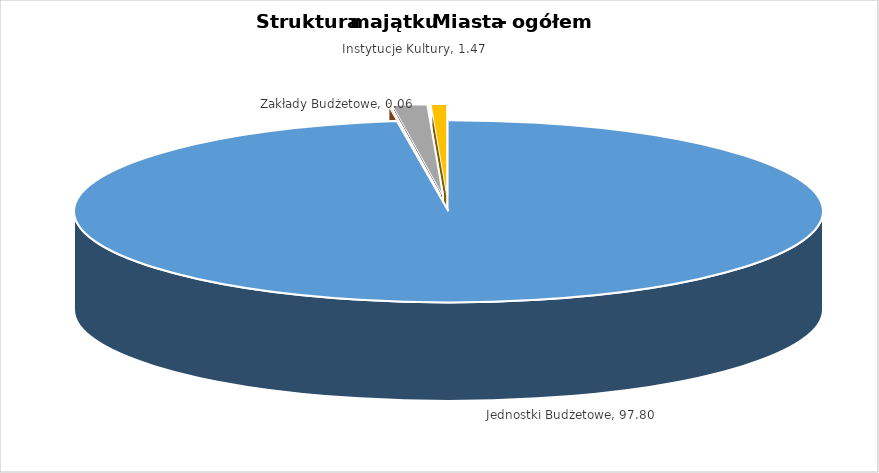
| Category | Struktura majątku Miasta - ogółem |
|---|---|
| Jednostki Budżetowe | 97.8 |
| Zakłady Budżetowe | 0.06 |
| Instytucje Kultury | 1.47 |
| Majątek Miasta oddany  | 0.67 |